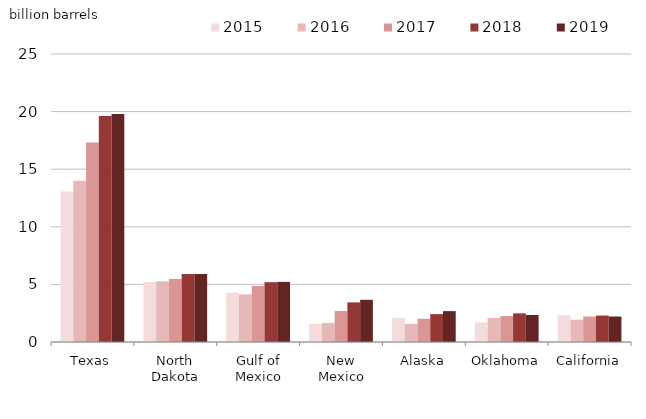
| Category | 2015 | 2016 | 2017 | 2018 | 2019 |
|---|---|---|---|---|---|
| Texas | 13.057 | 13.998 | 17.327 | 19.617 | 19.796 |
| North Dakota | 5.207 | 5.27 | 5.474 | 5.896 | 5.899 |
| Gulf of Mexico | 4.27 | 4.138 | 4.867 | 5.191 | 5.219 |
| New Mexico | 1.581 | 1.655 | 2.689 | 3.439 | 3.665 |
| Alaska | 2.104 | 1.574 | 2.016 | 2.421 | 2.68 |
| Oklahoma | 1.697 | 2.083 | 2.25 | 2.487 | 2.342 |
| California | 2.335 | 1.933 | 2.209 | 2.296 | 2.213 |